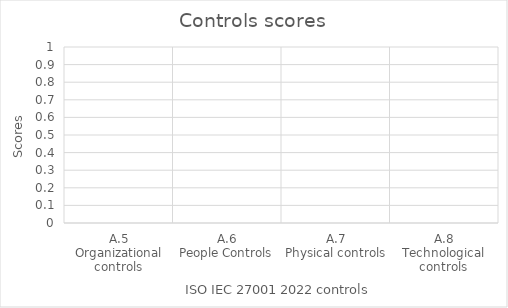
| Category | Controls |
|---|---|
| A.5
Organizational controls | 0 |
| A.6
People Controls | 0 |
| A.7
Physical controls | 0 |
| A.8
Technological controls | 0 |